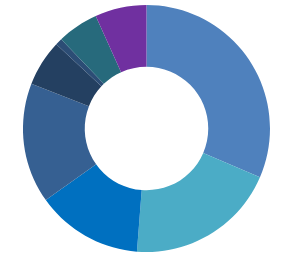
| Category | Series 0 |
|---|---|
| 0 | 0.315 |
| 1 | 0.198 |
| 2 | 0.139 |
| 3 | 0 |
| 4 | 0.157 |
| 5 | 0.061 |
| 6 | 0.009 |
| 7 | 0.054 |
| 8 | 0.067 |
| 9 | 0 |